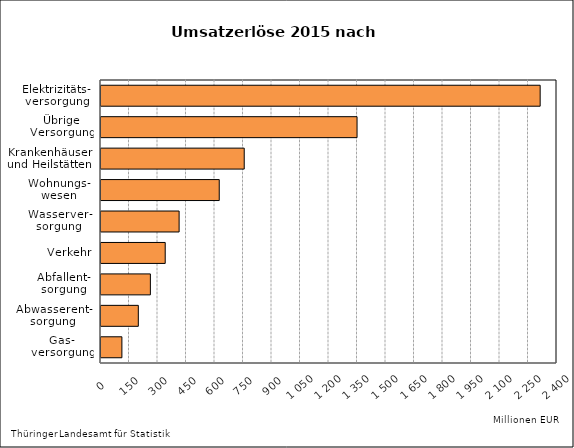
| Category | Series 1 |
|---|---|
| Gas-
versorgung | 109.956 |
| Abwasserent-
sorgung | 196.388 |
| Abfallent-
sorgung | 259.926 |
| Verkehr | 337.977 |
| Wasserver-
sorgung | 411.123 |
| Wohnungs-
wesen | 622.345 |
| Krankenhäuser
und Heilstätten | 753.844 |
| Übrige
Versorgung | 1347.624 |
| Elektrizitäts-
versorgung | 2311.37 |